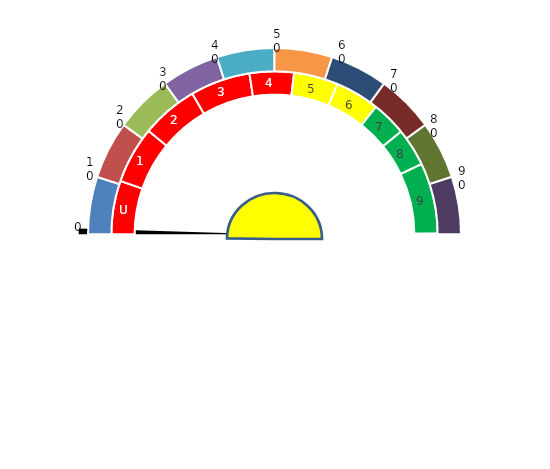
| Category | Pointer |
|---|---|
| 0 | 0 |
| 1 | 1 |
| 2 | 199 |